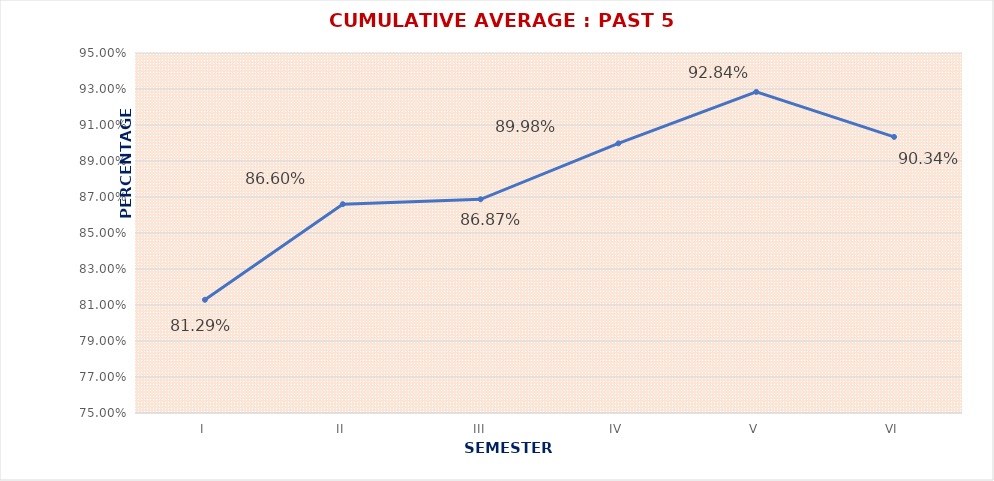
| Category | CUMULATIVE AVERAGE : PAST 5 YEARS |
|---|---|
| I | 0.813 |
| II | 0.866 |
| III | 0.869 |
| IV | 0.9 |
| V | 0.928 |
| VI | 0.903 |